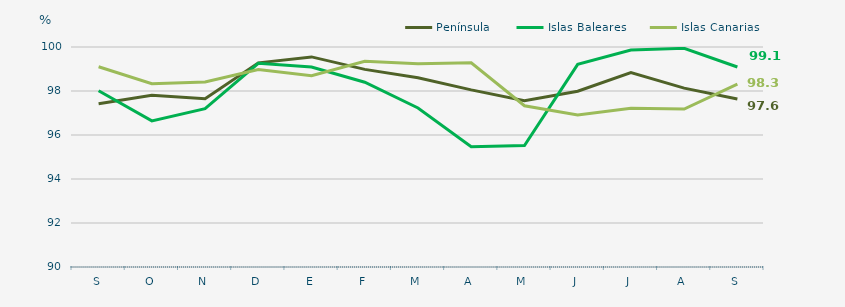
| Category | Península | Islas Baleares | Islas Canarias |
|---|---|---|---|
| S | 97.42 | 98.01 | 99.1 |
| O | 97.81 | 96.64 | 98.33 |
| N | 97.65 | 97.2 | 98.41 |
| D | 99.28 | 99.26 | 98.98 |
| E | 99.55 | 99.09 | 98.69 |
| F | 98.984 | 98.4 | 99.35 |
| M | 98.6 | 97.23 | 99.24 |
| A | 98.05 | 95.47 | 99.28 |
| M | 97.56 | 95.52 | 97.33 |
| J | 97.99 | 99.21 | 96.91 |
| J | 98.84 | 99.86 | 97.22 |
| A | 98.13 | 99.94 | 97.18 |
| S | 97.64 | 99.09 | 98.31 |